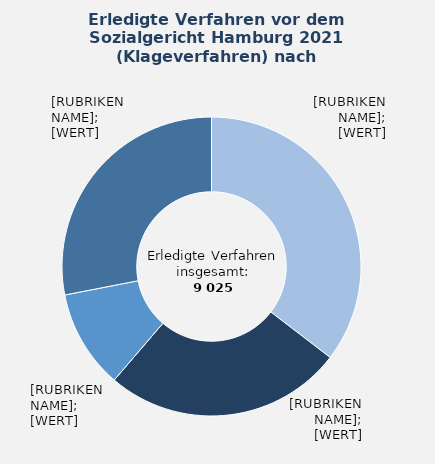
| Category | in Prozent |
|---|---|
| Krankenversicherung | 35.413 |
| Angelegenheiten nach dem SGB II | 25.861 |
| Rentenversicherung | 10.67 |
| Übrige Sachgebiete¹ | 28.055 |